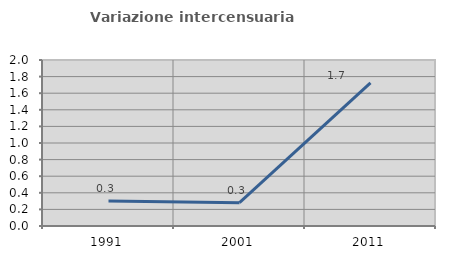
| Category | Variazione intercensuaria annua |
|---|---|
| 1991.0 | 0.302 |
| 2001.0 | 0.28 |
| 2011.0 | 1.725 |